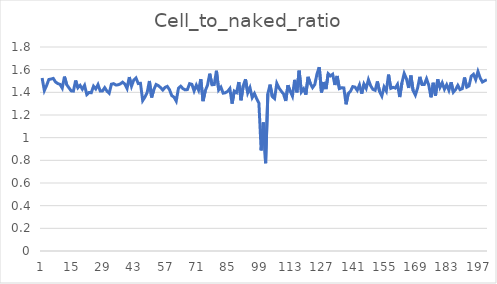
| Category | Cell_to_naked_ratio |
|---|---|
| 0 | 1.527 |
| 1 | 1.416 |
| 2 | 1.46 |
| 3 | 1.513 |
| 4 | 1.517 |
| 5 | 1.523 |
| 6 | 1.491 |
| 7 | 1.478 |
| 8 | 1.47 |
| 9 | 1.437 |
| 10 | 1.539 |
| 11 | 1.468 |
| 12 | 1.44 |
| 13 | 1.413 |
| 14 | 1.411 |
| 15 | 1.504 |
| 16 | 1.44 |
| 17 | 1.461 |
| 18 | 1.428 |
| 19 | 1.462 |
| 20 | 1.38 |
| 21 | 1.399 |
| 22 | 1.397 |
| 23 | 1.454 |
| 24 | 1.43 |
| 25 | 1.468 |
| 26 | 1.411 |
| 27 | 1.412 |
| 28 | 1.441 |
| 29 | 1.411 |
| 30 | 1.392 |
| 31 | 1.472 |
| 32 | 1.477 |
| 33 | 1.465 |
| 34 | 1.466 |
| 35 | 1.474 |
| 36 | 1.49 |
| 37 | 1.473 |
| 38 | 1.434 |
| 39 | 1.535 |
| 40 | 1.454 |
| 41 | 1.508 |
| 42 | 1.527 |
| 43 | 1.478 |
| 44 | 1.48 |
| 45 | 1.327 |
| 46 | 1.358 |
| 47 | 1.399 |
| 48 | 1.5 |
| 49 | 1.355 |
| 50 | 1.425 |
| 51 | 1.469 |
| 52 | 1.46 |
| 53 | 1.442 |
| 54 | 1.42 |
| 55 | 1.443 |
| 56 | 1.453 |
| 57 | 1.423 |
| 58 | 1.371 |
| 59 | 1.358 |
| 60 | 1.323 |
| 61 | 1.435 |
| 62 | 1.454 |
| 63 | 1.433 |
| 64 | 1.422 |
| 65 | 1.424 |
| 66 | 1.477 |
| 67 | 1.471 |
| 68 | 1.413 |
| 69 | 1.463 |
| 70 | 1.42 |
| 71 | 1.516 |
| 72 | 1.322 |
| 73 | 1.415 |
| 74 | 1.463 |
| 75 | 1.565 |
| 76 | 1.468 |
| 77 | 1.468 |
| 78 | 1.59 |
| 79 | 1.421 |
| 80 | 1.446 |
| 81 | 1.393 |
| 82 | 1.397 |
| 83 | 1.408 |
| 84 | 1.433 |
| 85 | 1.301 |
| 86 | 1.411 |
| 87 | 1.398 |
| 88 | 1.491 |
| 89 | 1.33 |
| 90 | 1.458 |
| 91 | 1.515 |
| 92 | 1.395 |
| 93 | 1.441 |
| 94 | 1.354 |
| 95 | 1.389 |
| 96 | 1.343 |
| 97 | 1.305 |
| 98 | 0.888 |
| 99 | 1.134 |
| 100 | 0.775 |
| 101 | 1.387 |
| 102 | 1.468 |
| 103 | 1.363 |
| 104 | 1.345 |
| 105 | 1.479 |
| 106 | 1.438 |
| 107 | 1.41 |
| 108 | 1.386 |
| 109 | 1.324 |
| 110 | 1.462 |
| 111 | 1.41 |
| 112 | 1.366 |
| 113 | 1.51 |
| 114 | 1.4 |
| 115 | 1.591 |
| 116 | 1.403 |
| 117 | 1.431 |
| 118 | 1.38 |
| 119 | 1.536 |
| 120 | 1.478 |
| 121 | 1.442 |
| 122 | 1.469 |
| 123 | 1.564 |
| 124 | 1.622 |
| 125 | 1.399 |
| 126 | 1.491 |
| 127 | 1.429 |
| 128 | 1.564 |
| 129 | 1.545 |
| 130 | 1.56 |
| 131 | 1.465 |
| 132 | 1.544 |
| 133 | 1.433 |
| 134 | 1.44 |
| 135 | 1.439 |
| 136 | 1.295 |
| 137 | 1.391 |
| 138 | 1.41 |
| 139 | 1.451 |
| 140 | 1.446 |
| 141 | 1.417 |
| 142 | 1.466 |
| 143 | 1.389 |
| 144 | 1.473 |
| 145 | 1.435 |
| 146 | 1.512 |
| 147 | 1.458 |
| 148 | 1.426 |
| 149 | 1.418 |
| 150 | 1.496 |
| 151 | 1.406 |
| 152 | 1.367 |
| 153 | 1.447 |
| 154 | 1.411 |
| 155 | 1.556 |
| 156 | 1.435 |
| 157 | 1.444 |
| 158 | 1.438 |
| 159 | 1.47 |
| 160 | 1.358 |
| 161 | 1.485 |
| 162 | 1.567 |
| 163 | 1.52 |
| 164 | 1.439 |
| 165 | 1.548 |
| 166 | 1.415 |
| 167 | 1.376 |
| 168 | 1.438 |
| 169 | 1.536 |
| 170 | 1.468 |
| 171 | 1.469 |
| 172 | 1.52 |
| 173 | 1.463 |
| 174 | 1.356 |
| 175 | 1.484 |
| 176 | 1.37 |
| 177 | 1.514 |
| 178 | 1.443 |
| 179 | 1.485 |
| 180 | 1.428 |
| 181 | 1.467 |
| 182 | 1.418 |
| 183 | 1.489 |
| 184 | 1.401 |
| 185 | 1.424 |
| 186 | 1.462 |
| 187 | 1.424 |
| 188 | 1.433 |
| 189 | 1.531 |
| 190 | 1.446 |
| 191 | 1.456 |
| 192 | 1.542 |
| 193 | 1.559 |
| 194 | 1.512 |
| 195 | 1.584 |
| 196 | 1.527 |
| 197 | 1.491 |
| 198 | 1.502 |
| 199 | 1.511 |